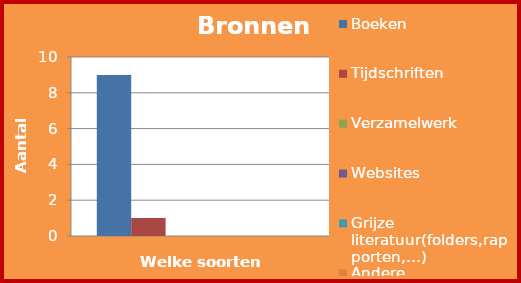
| Category | Boeken | Tijdschriften | Verzamelwerk  | Websites | Grijze literatuur(folders,rapporten,…) | Andere |
|---|---|---|---|---|---|---|
| Aantal  | 9 | 1 | 0 | 0 | 0 | 0 |